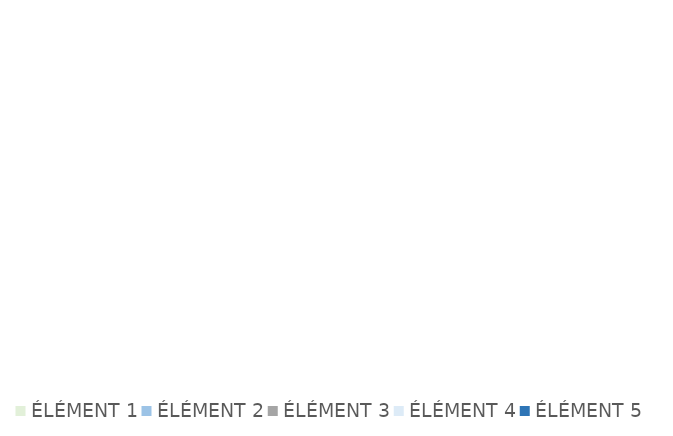
| Category | Series 0 |
|---|---|
| ÉLÉMENT 1 | 0 |
| ÉLÉMENT 2 | 0 |
| ÉLÉMENT 3 | 0 |
| ÉLÉMENT 4 | 0 |
| ÉLÉMENT 5 | 0 |